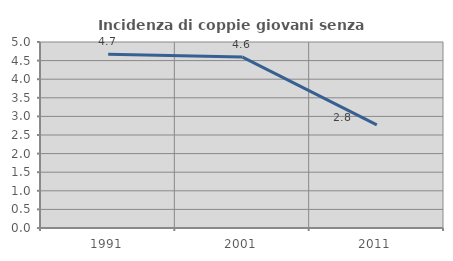
| Category | Incidenza di coppie giovani senza figli |
|---|---|
| 1991.0 | 4.673 |
| 2001.0 | 4.595 |
| 2011.0 | 2.774 |